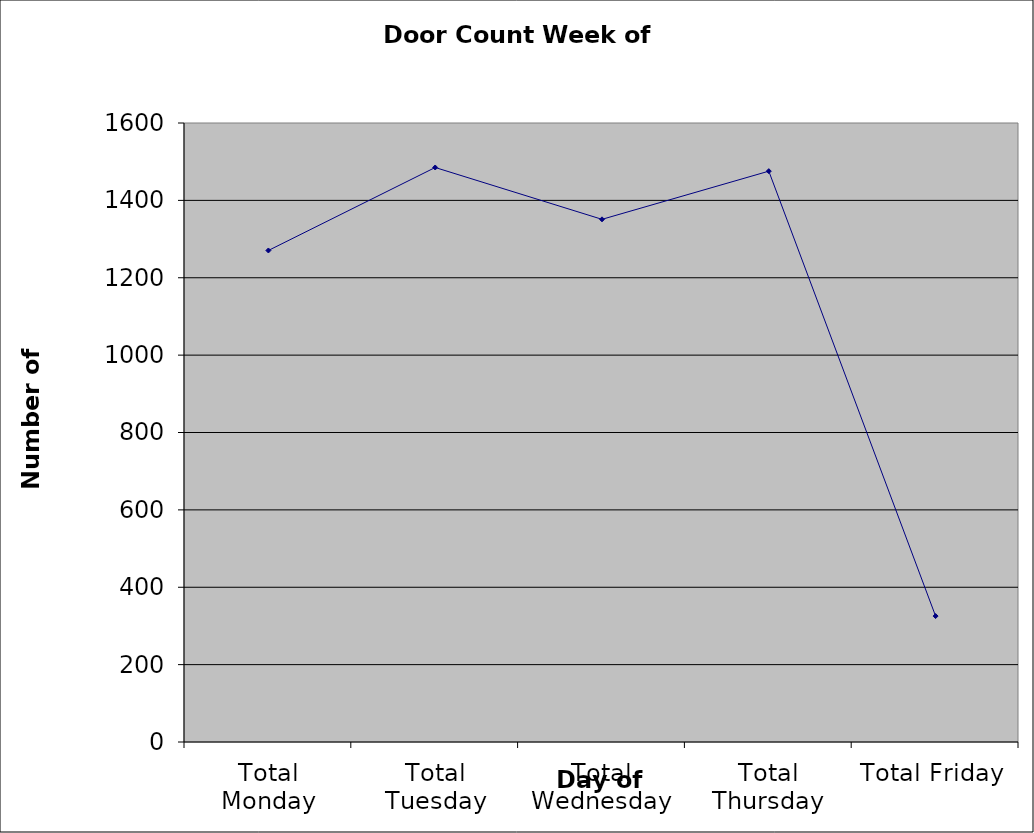
| Category | Series 0 |
|---|---|
| Total Monday | 1270.5 |
| Total Tuesday | 1485 |
| Total Wednesday | 1351 |
| Total Thursday | 1475.5 |
| Total Friday | 325.5 |